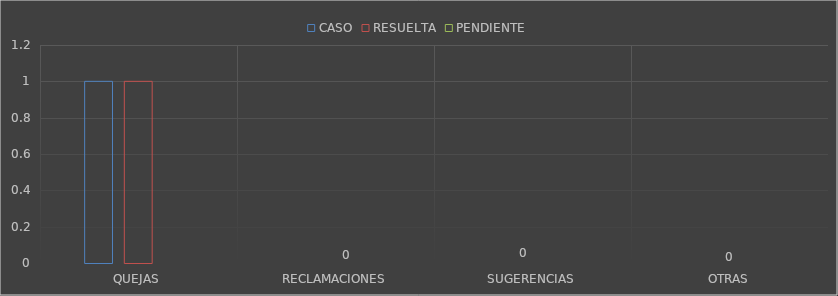
| Category | CASO | RESUELTA | PENDIENTE |
|---|---|---|---|
| QUEJAS | 1 | 1 | 0 |
| RECLAMACIONES | 0 | 0 | 0 |
| SUGERENCIAS | 0 | 0 | 0 |
| OTRAS | 0 | 0 | 0 |